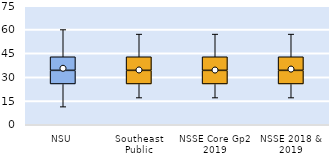
| Category | 25th | 50th | 75th |
|---|---|---|---|
| NSU | 25.714 | 8.571 | 8.571 |
| Southeast Public | 25.714 | 8.571 | 8.571 |
| NSSE Core Gp2 2019 | 25.714 | 8.571 | 8.571 |
| NSSE 2018 & 2019 | 25.714 | 8.571 | 8.571 |